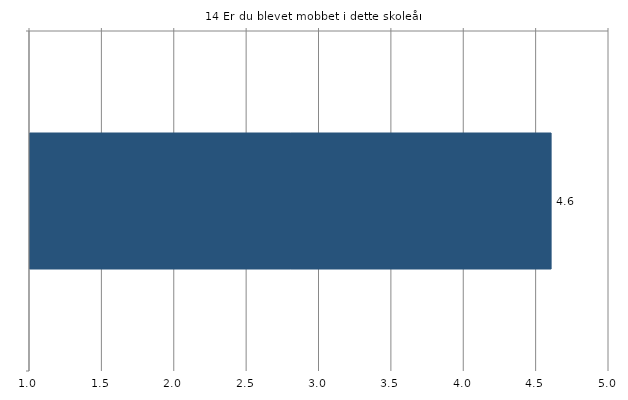
| Category | Gns. |
|---|---|
|    | 4.6 |